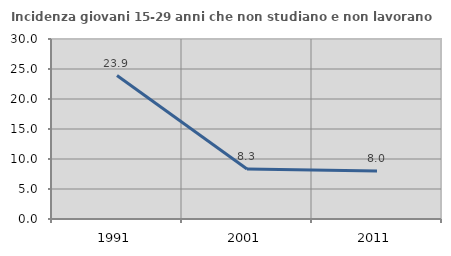
| Category | Incidenza giovani 15-29 anni che non studiano e non lavorano  |
|---|---|
| 1991.0 | 23.913 |
| 2001.0 | 8.333 |
| 2011.0 | 8 |